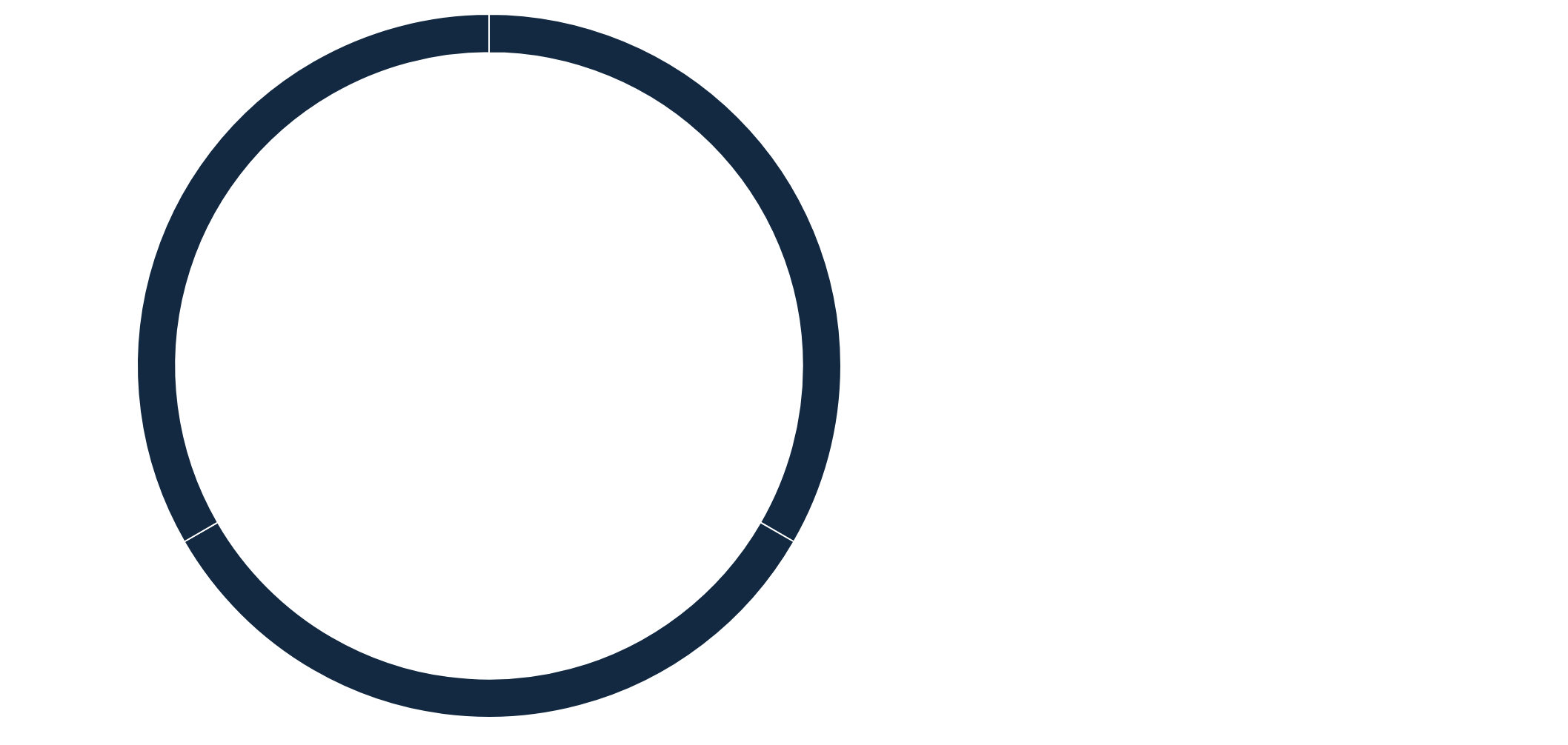
| Category | Series 0 |
|---|---|
| 1) WinNova 2) POLJIN 3) Työelämä |  |